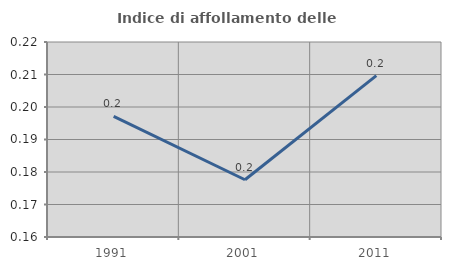
| Category | Indice di affollamento delle abitazioni  |
|---|---|
| 1991.0 | 0.197 |
| 2001.0 | 0.178 |
| 2011.0 | 0.21 |